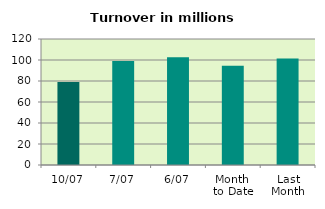
| Category | Series 0 |
|---|---|
| 10/07 | 79.157 |
| 7/07 | 98.95 |
| 6/07 | 102.502 |
| Month 
to Date | 94.526 |
| Last
Month | 101.544 |